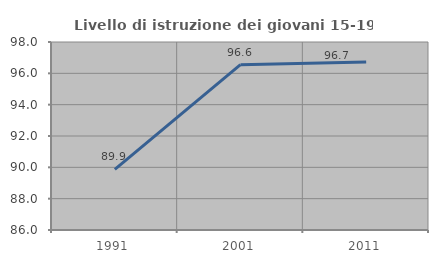
| Category | Livello di istruzione dei giovani 15-19 anni |
|---|---|
| 1991.0 | 89.873 |
| 2001.0 | 96.552 |
| 2011.0 | 96.721 |